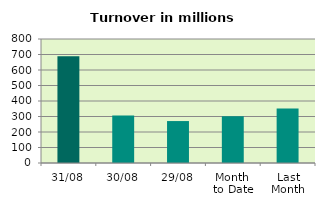
| Category | Series 0 |
|---|---|
| 31/08 | 689.04 |
| 30/08 | 306.211 |
| 29/08 | 270.603 |
| Month 
to Date | 301.741 |
| Last
Month | 352.063 |